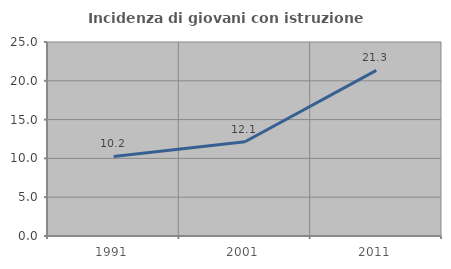
| Category | Incidenza di giovani con istruzione universitaria |
|---|---|
| 1991.0 | 10.25 |
| 2001.0 | 12.141 |
| 2011.0 | 21.342 |